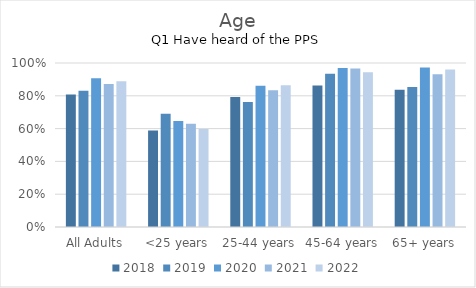
| Category | 2018 | 2019 | 2020 | 2021 | 2022 |
|---|---|---|---|---|---|
| All Adults | 0.808 | 0.831 | 0.907 | 0.872 | 0.888 |
| <25 years | 0.589 | 0.691 | 0.646 | 0.629 | 0.597 |
| 25-44 years | 0.793 | 0.762 | 0.861 | 0.834 | 0.865 |
| 45-64 years | 0.863 | 0.934 | 0.97 | 0.966 | 0.944 |
| 65+ years | 0.837 | 0.853 | 0.973 | 0.931 | 0.961 |